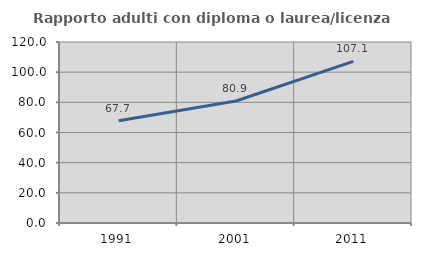
| Category | Rapporto adulti con diploma o laurea/licenza media  |
|---|---|
| 1991.0 | 67.742 |
| 2001.0 | 80.87 |
| 2011.0 | 107.143 |